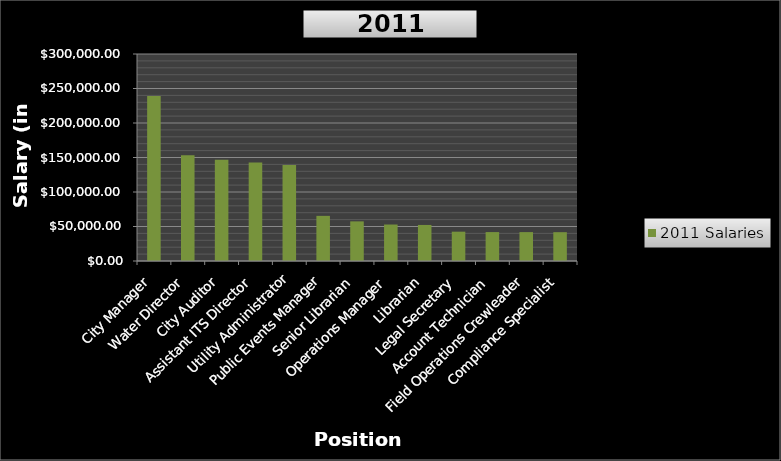
| Category | 2011 Salaries |
|---|---|
| City Manager | 239057.725 |
| Water Director | 153240.88 |
| City Auditor | 146695.64 |
| Assistant ITS Director | 142877.595 |
| Utility Administrator | 139190.37 |
| Public Events Manager | 65418.44 |
| Senior Librarian | 57442.64 |
| Operations Manager | 52862.885 |
| Librarian | 52241.28 |
| Legal Secretary | 42505.95 |
| Account Technician | 41901.6 |
| Field Operations Crewleader | 41879.76 |
| Compliance Specialist | 41771.6 |